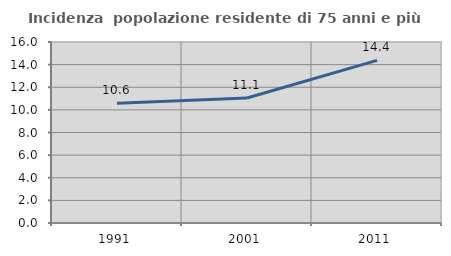
| Category | Incidenza  popolazione residente di 75 anni e più |
|---|---|
| 1991.0 | 10.591 |
| 2001.0 | 11.055 |
| 2011.0 | 14.379 |